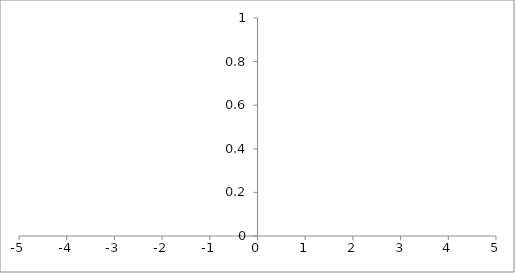
| Category | Series 0 |
|---|---|
| 0.0 | 0 |
| 0.0 | 0 |
| 0.0 | 0 |
| 0.0 | 0 |
| 0.0 | 0 |
| 0.0 | 0 |
| 0.0 | 0 |
| 0.0 | 0 |
| 0.0 | 0 |
| 0.0 | 0 |
| 0.0 | 0 |
| 0.0 | 0 |
| 0.0 | 0 |
| 0.0 | 0 |
| 0.0 | 0 |
| 0.0 | 0 |
| 0.0 | 0 |
| 0.0 | 0 |
| 0.0 | 0 |
| 0.0 | 0 |
| 0.0 | 0 |
| 0.0 | 0 |
| 0.0 | 0 |
| 0.0 | 0 |
| 0.0 | 0 |
| 0.0 | 0 |
| 0.0 | 0 |
| 0.0 | 0 |
| 0.0 | 0 |
| 0.0 | 0 |
| 0.0 | 0 |
| 0.0 | 0 |
| 0.0 | 0 |
| 0.0 | 0 |
| 0.0 | 0 |
| 0.0 | 0 |
| 0.0 | 0 |
| 0.0 | 0 |
| 0.0 | 0 |
| 0.0 | 0 |
| 0.0 | 0 |
| 0.0 | 0 |
| 0.0 | 0 |
| 0.0 | 0 |
| 0.0 | 0 |
| 0.0 | 0 |
| 0.0 | 0 |
| 0.0 | 0 |
| 0.0 | 0 |
| 0.0 | 0 |
| 0.0 | 0 |
| 0.0 | 0 |
| 0.0 | 0 |
| 0.0 | 0 |
| 0.0 | 0 |
| 0.0 | 0 |
| 0.0 | 0 |
| 0.0 | 0 |
| 0.0 | 0 |
| 0.0 | 0 |
| 0.0 | 0 |
| 0.0 | 0 |
| 0.0 | 0 |
| 0.0 | 0 |
| 0.0 | 0 |
| 0.0 | 0 |
| 0.0 | 0 |
| 0.0 | 0 |
| 0.0 | 0 |
| 0.0 | 0 |
| 0.0 | 0 |
| 0.0 | 0 |
| 0.0 | 0 |
| 0.0 | 0 |
| 0.0 | 0 |
| 0.0 | 0 |
| 0.0 | 0 |
| 0.0 | 0 |
| 0.0 | 0 |
| 0.0 | 0 |
| 0.0 | 0 |
| 0.0 | 0 |
| 0.0 | 0 |
| 0.0 | 0 |
| 0.0 | 0 |
| 0.0 | 0 |
| 0.0 | 0 |
| 0.0 | 0 |
| 0.0 | 0 |
| 0.0 | 0 |
| 0.0 | 0 |
| 0.0 | 0 |
| 0.0 | 0 |
| 0.0 | 0 |
| 0.0 | 0 |
| 0.0 | 0 |
| 0.0 | 0 |
| 0.0 | 0 |
| 0.0 | 0 |
| 0.0 | 0 |
| 0.0 | 0 |
| 0.0 | 0 |
| 0.0 | 0 |
| 0.0 | 0 |
| 0.0 | 0 |
| 0.0 | 0 |
| 0.0 | 0 |
| 0.0 | 0 |
| 0.0 | 0 |
| 0.0 | 0 |
| 0.0 | 0 |
| 0.0 | 0 |
| 0.0 | 0 |
| 0.0 | 0 |
| 0.0 | 0 |
| 0.0 | 0 |
| 0.0 | 0 |
| 0.0 | 0 |
| 0.0 | 0 |
| 0.0 | 0 |
| 0.0 | 0 |
| 0.0 | 0 |
| 0.0 | 0 |
| 0.0 | 0 |
| 0.0 | 0 |
| 0.0 | 0 |
| 0.0 | 0 |
| 0.0 | 0 |
| 0.0 | 0 |
| 0.0 | 0 |
| 0.0 | 0 |
| 0.0 | 0 |
| 0.0 | 0 |
| 0.0 | 0 |
| 0.0 | 0 |
| 0.0 | 0 |
| 0.0 | 0 |
| 0.0 | 0 |
| 0.0 | 0 |
| 0.0 | 0 |
| 0.0 | 0 |
| 0.0 | 0 |
| 0.0 | 0 |
| 0.0 | 0 |
| 0.0 | 0 |
| 0.0 | 0 |
| 0.0 | 0 |
| 0.0 | 0 |
| 0.0 | 0 |
| 0.0 | 0 |
| 0.0 | 0 |
| 0.0 | 0 |
| 0.0 | 0 |
| 0.0 | 0 |
| 0.0 | 0 |
| 0.0 | 0 |
| 0.0 | 0 |
| 0.0 | 0 |
| 0.0 | 0 |
| 0.0 | 0 |
| 0.0 | 0 |
| 0.0 | 0 |
| 0.0 | 0 |
| 0.0 | 0 |
| 0.0 | 0 |
| 0.0 | 0 |
| 0.0 | 0 |
| 0.0 | 0 |
| 0.0 | 0 |
| 0.0 | 0 |
| 0.0 | 0 |
| 0.0 | 0 |
| 0.0 | 0 |
| 0.0 | 0 |
| 0.0 | 0 |
| 0.0 | 0 |
| 0.0 | 0 |
| 0.0 | 0 |
| 0.0 | 0 |
| 0.0 | 0 |
| 0.0 | 0 |
| 0.0 | 0 |
| 0.0 | 0 |
| 0.0 | 0 |
| 0.0 | 0 |
| 0.0 | 0 |
| 0.0 | 0 |
| 0.0 | 0 |
| 0.0 | 0 |
| 0.0 | 0 |
| 0.0 | 0 |
| 0.0 | 0 |
| 0.0 | 0 |
| 0.0 | 0 |
| 0.0 | 0 |
| 0.0 | 0 |
| 0.0 | 0 |
| 0.0 | 0 |
| 0.0 | 0 |
| 0.0 | 0 |
| 0.0 | 0 |